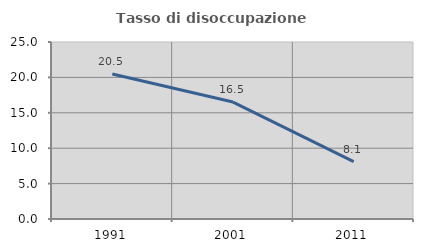
| Category | Tasso di disoccupazione giovanile  |
|---|---|
| 1991.0 | 20.482 |
| 2001.0 | 16.514 |
| 2011.0 | 8.108 |